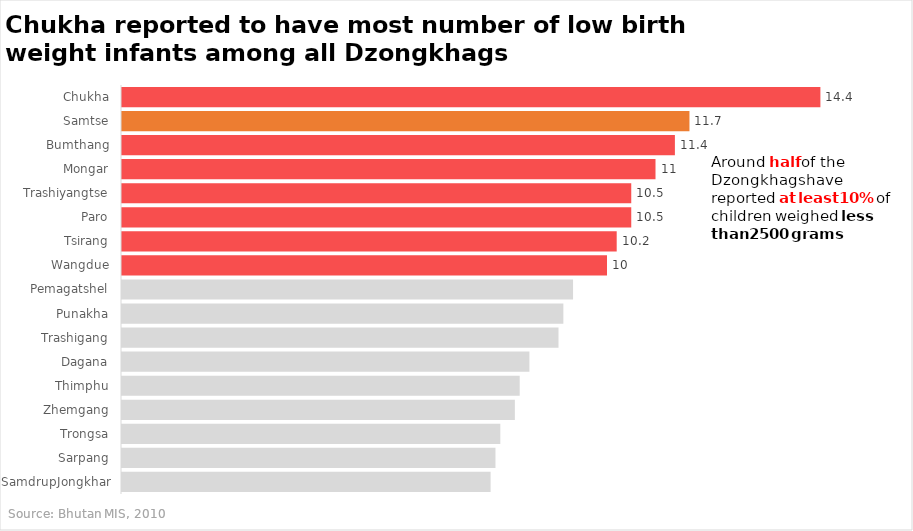
| Category | Below 2500 grams |
|---|---|
| SamdrupJongkhar | 7.6 |
| Sarpang | 7.7 |
| Trongsa | 7.8 |
| Zhemgang | 8.1 |
| Thimphu | 8.2 |
| Dagana | 8.4 |
| Trashigang | 9 |
| Punakha | 9.1 |
| Pemagatshel | 9.3 |
| Wangdue | 10 |
| Tsirang | 10.2 |
| Paro | 10.5 |
| Trashiyangtse | 10.5 |
| Mongar | 11 |
| Bumthang | 11.4 |
| Samtse | 11.7 |
| Chukha | 14.4 |